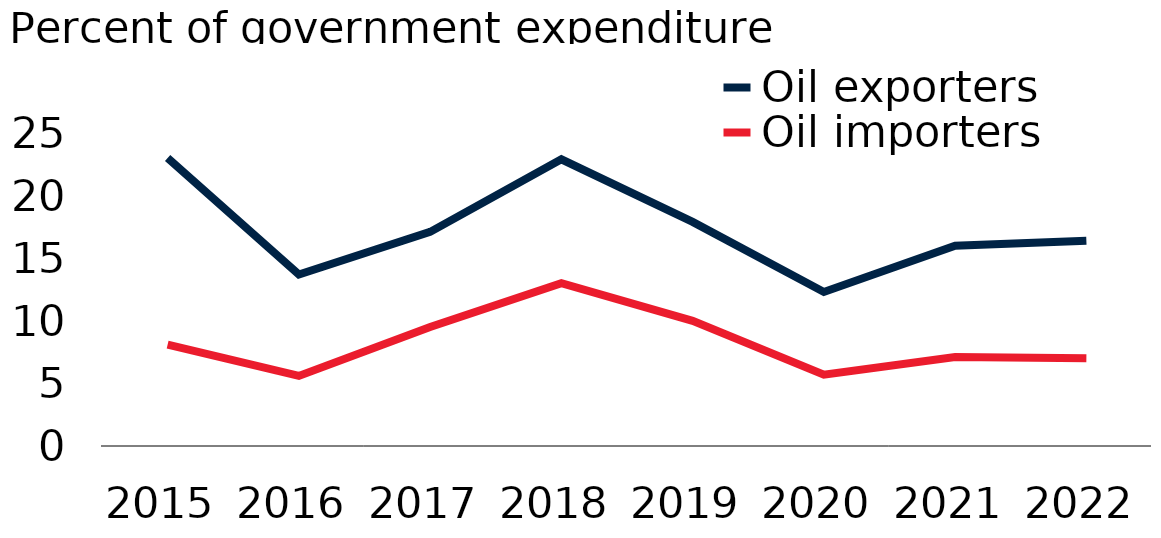
| Category | Oil exporters | Oil importers |
|---|---|---|
| 2015.0 | 23 | 8.1 |
| 2016.0 | 13.7 | 5.6 |
| 2017.0 | 17.1 | 9.5 |
| 2018.0 | 22.9 | 13 |
| 2019.0 | 17.9 | 10 |
| 2020.0 | 12.3 | 5.7 |
| 2021.0 | 16 | 7.1 |
| 2022.0 | 16.4 | 7 |